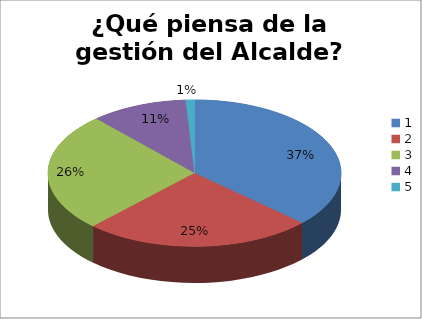
| Category | Series 0 |
|---|---|
| 0 | 38 |
| 1 | 26 |
| 2 | 27 |
| 3 | 11 |
| 4 | 1 |